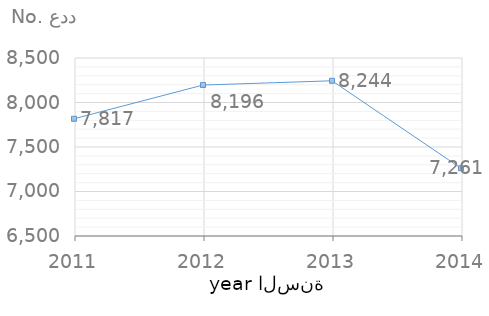
| Category | القيمة
Value |
|---|---|
| 2014.0 | 7261 |
| 2013.0 | 8244 |
| 2012.0 | 8196 |
| 2011.0 | 7817 |